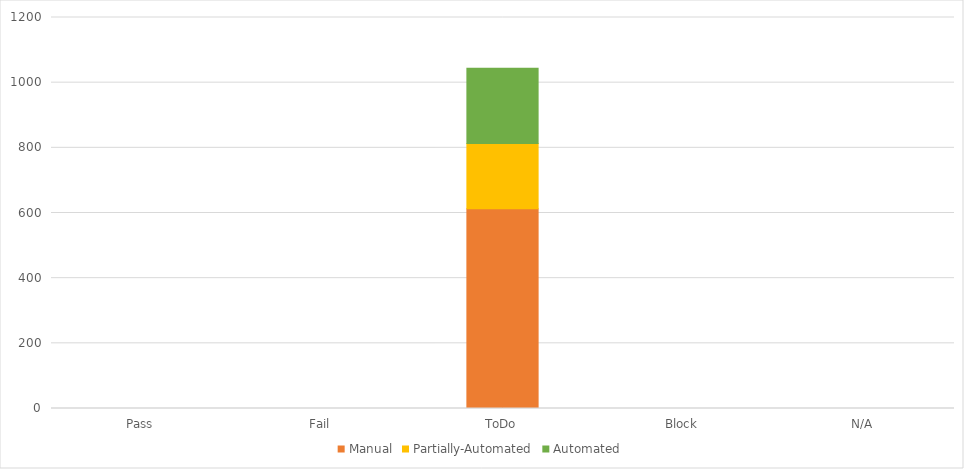
| Category | Manual | Partially-Automated | Automated |
|---|---|---|---|
| Pass | 0 | 0 | 0 |
| Fail | 0 | 0 | 0 |
| ToDo | 613 | 200 | 231 |
| Block | 0 | 0 | 0 |
| N/A | 0 | 0 | 0 |